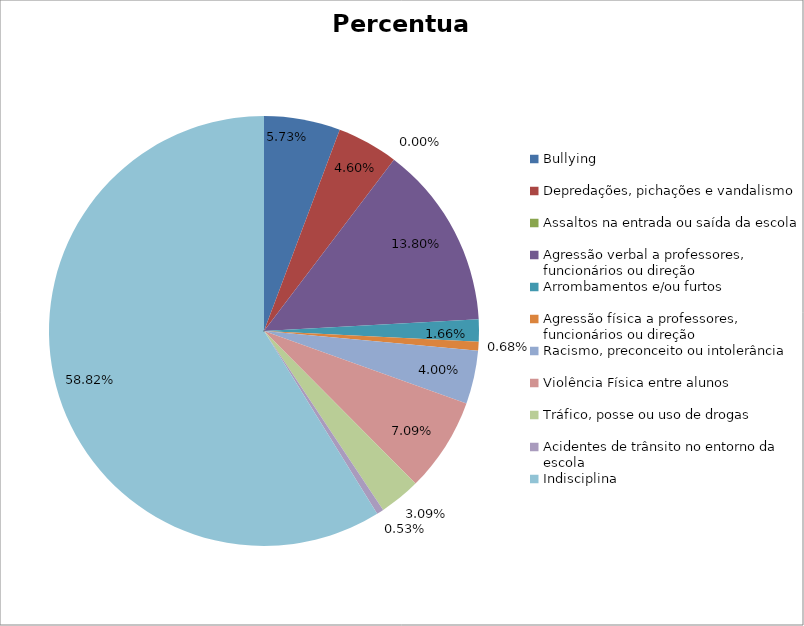
| Category | Percentual |
|---|---|
| Bullying | 0.057 |
| Depredações, pichações e vandalismo | 0.046 |
| Assaltos na entrada ou saída da escola | 0 |
| Agressão verbal a professores, funcionários ou direção | 0.138 |
| Arrombamentos e/ou furtos | 0.017 |
| Agressão física a professores, funcionários ou direção | 0.007 |
| Racismo, preconceito ou intolerância | 0.04 |
| Violência Física entre alunos | 0.071 |
| Tráfico, posse ou uso de drogas | 0.031 |
| Acidentes de trânsito no entorno da escola | 0.005 |
| Indisciplina | 0.588 |